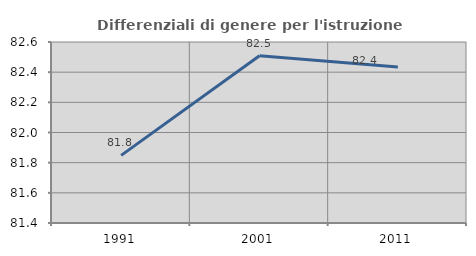
| Category | Differenziali di genere per l'istruzione superiore |
|---|---|
| 1991.0 | 81.848 |
| 2001.0 | 82.509 |
| 2011.0 | 82.434 |